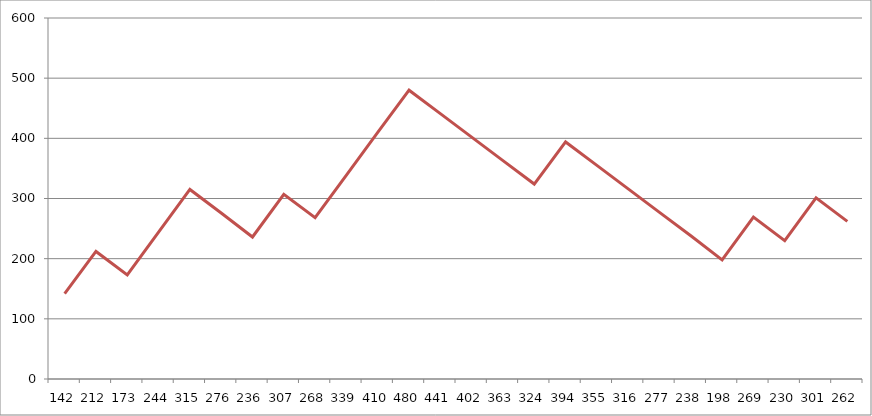
| Category | 71 |
|---|---|
| 142.0 | 142 |
| 212.0 | 212 |
| 173.0 | 173 |
| 244.0 | 244 |
| 315.0 | 315 |
| 276.0 | 276 |
| 236.0 | 236 |
| 307.0 | 307 |
| 268.0 | 268 |
| 339.0 | 339 |
| 410.0 | 410 |
| 480.0 | 480 |
| 441.0 | 441 |
| 402.0 | 402 |
| 363.0 | 363 |
| 324.0 | 324 |
| 394.0 | 394 |
| 355.0 | 355 |
| 316.0 | 316 |
| 277.0 | 277 |
| 238.0 | 238 |
| 198.0 | 198 |
| 269.0 | 269 |
| 230.0 | 230 |
| 301.0 | 301 |
| 262.0 | 262 |